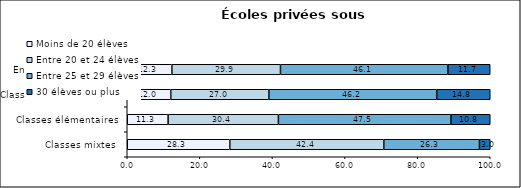
| Category | Moins de 20 élèves | Entre 20 et 24 élèves | Entre 25 et 29 élèves | 30 élèves ou plus |
|---|---|---|---|---|
| Classes mixtes | 28.25 | 42.43 | 26.34 | 2.98 |
| Classes élémentaires | 11.26 | 30.38 | 47.53 | 10.83 |
| Classes préélémentaires | 11.99 | 27.03 | 46.23 | 14.75 |
| Ensemble des classes | 12.29 | 29.92 | 46.12 | 11.66 |